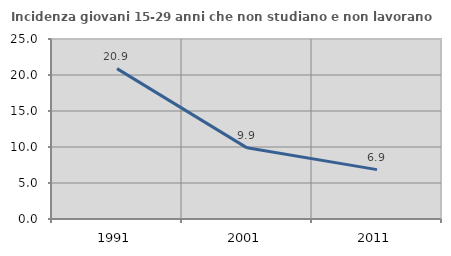
| Category | Incidenza giovani 15-29 anni che non studiano e non lavorano  |
|---|---|
| 1991.0 | 20.886 |
| 2001.0 | 9.881 |
| 2011.0 | 6.858 |